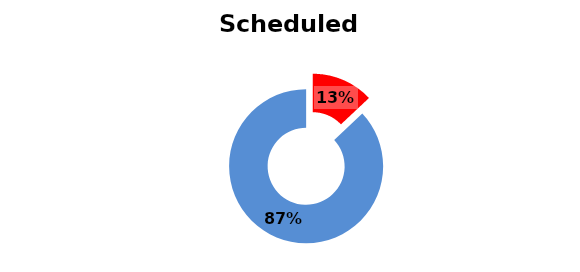
| Category | Scheduled monuments  |
|---|---|
| 0 | 0.13 |
| 1 | 0.87 |